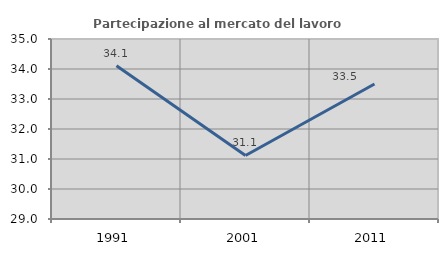
| Category | Partecipazione al mercato del lavoro  femminile |
|---|---|
| 1991.0 | 34.109 |
| 2001.0 | 31.118 |
| 2011.0 | 33.501 |